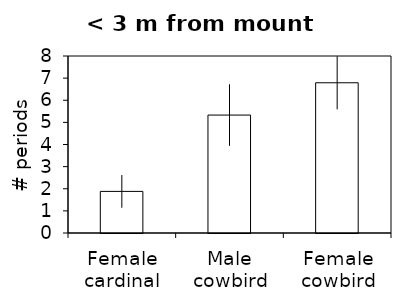
| Category | Series 0 |
|---|---|
| Female cardinal | 1.88 |
| Male cowbird | 5.33 |
| Female cowbird | 6.79 |